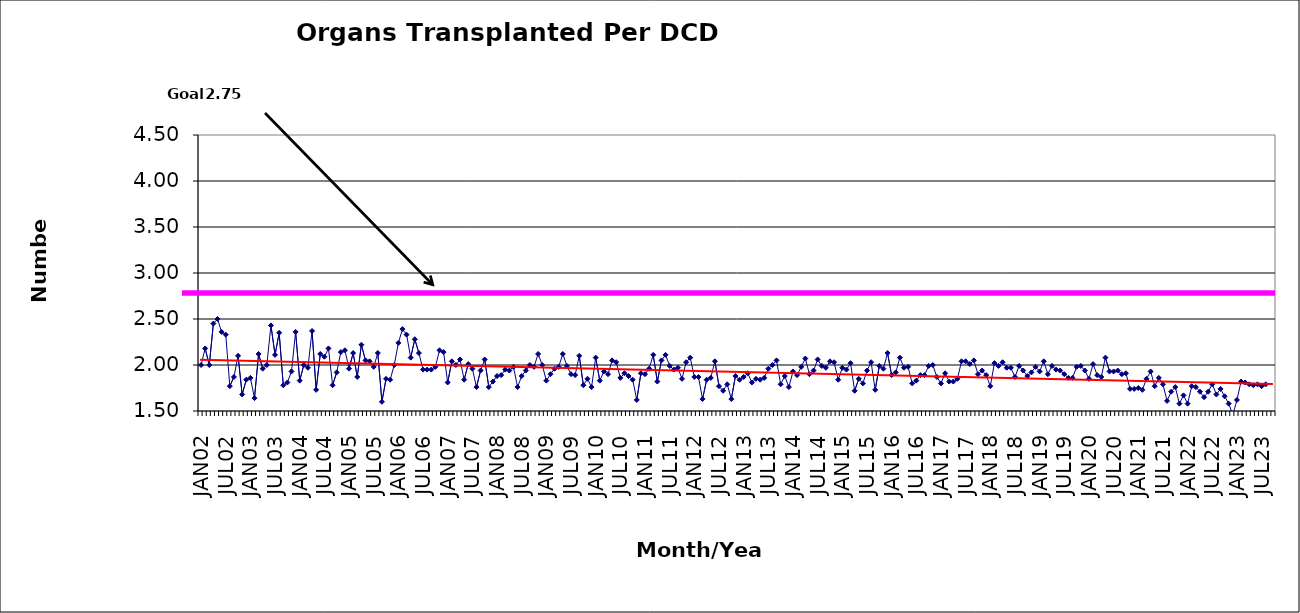
| Category | Series 0 |
|---|---|
| JAN02 | 2 |
| FEB02 | 2.18 |
| MAR02 | 2 |
| APR02 | 2.45 |
| MAY02 | 2.5 |
| JUN02 | 2.36 |
| JUL02 | 2.33 |
| AUG02 | 1.77 |
| SEP02 | 1.87 |
| OCT02 | 2.1 |
| NOV02 | 1.68 |
| DEC02 | 1.84 |
| JAN03 | 1.86 |
| FEB03 | 1.64 |
| MAR03 | 2.12 |
| APR03 | 1.96 |
| MAY03 | 2 |
| JUN03 | 2.43 |
| JUL03 | 2.11 |
| AUG03 | 2.35 |
| SEP03 | 1.78 |
| OCT03 | 1.81 |
| NOV03 | 1.93 |
| DEC03 | 2.36 |
| JAN04 | 1.83 |
| FEB04 | 2 |
| MAR04 | 1.97 |
| APR04 | 2.37 |
| MAY04 | 1.73 |
| JUN04 | 2.12 |
| JUL04 | 2.09 |
| AUG04 | 2.18 |
| SEP04 | 1.78 |
| OCT04 | 1.92 |
| NOV04 | 2.14 |
| DEC04 | 2.16 |
| JAN05 | 1.96 |
| FEB05 | 2.13 |
| MAR05 | 1.87 |
| APR05 | 2.22 |
| MAY05 | 2.05 |
| JUN05 | 2.04 |
| JUL05 | 1.98 |
| AUG05 | 2.13 |
| SEP05 | 1.6 |
| OCT05 | 1.85 |
| NOV05 | 1.84 |
| DEC05 | 2 |
| JAN06 | 2.24 |
| FEB06 | 2.39 |
| MAR06 | 2.33 |
| APR06 | 2.08 |
| MAY06 | 2.28 |
| JUN06 | 2.13 |
| JUL06 | 1.95 |
| AUG06 | 1.95 |
| SEP06 | 1.95 |
| OCT06 | 1.98 |
| NOV06 | 2.16 |
| DEC06 | 2.14 |
| JAN07 | 1.81 |
| FEB07 | 2.04 |
| MAR07 | 2 |
| APR07 | 2.06 |
| MAY07 | 1.84 |
| JUN07 | 2.01 |
| JUL07 | 1.96 |
| AUG07 | 1.76 |
| SEP07 | 1.94 |
| OCT07 | 2.06 |
| NOV07 | 1.76 |
| DEC07 | 1.82 |
| JAN08 | 1.88 |
| FEB08 | 1.89 |
| MAR08 | 1.95 |
| APR08 | 1.94 |
| MAY08 | 1.98 |
| JUN08 | 1.76 |
| JUL08 | 1.88 |
| AUG08 | 1.94 |
| SEP08 | 2 |
| OCT08 | 1.98 |
| NOV08 | 2.12 |
| DEC08 | 2 |
| JAN09 | 1.83 |
| FEB09 | 1.9 |
| MAR09 | 1.96 |
| APR09 | 1.98 |
| MAY09 | 2.12 |
| JUN09 | 1.99 |
| JUL09 | 1.9 |
| AUG09 | 1.89 |
| SEP09 | 2.1 |
| OCT09 | 1.78 |
| NOV09 | 1.85 |
| DEC09 | 1.76 |
| JAN10 | 2.08 |
| FEB10 | 1.83 |
| MAR10 | 1.93 |
| APR10 | 1.9 |
| MAY10 | 2.05 |
| JUN10 | 2.03 |
| JUL10 | 1.86 |
| AUG10 | 1.91 |
| SEP10 | 1.88 |
| OCT10 | 1.84 |
| NOV10 | 1.62 |
| DEC10 | 1.91 |
| JAN11 | 1.9 |
| FEB11 | 1.96 |
| MAR11 | 2.11 |
| APR11 | 1.82 |
| MAY11 | 2.05 |
| JUN11 | 2.11 |
| JUL11 | 1.99 |
| AUG11 | 1.95 |
| SEP11 | 1.97 |
| OCT11 | 1.85 |
| NOV11 | 2.03 |
| DEC11 | 2.08 |
| JAN12 | 1.87 |
| FEB12 | 1.87 |
| MAR12 | 1.63 |
| APR12 | 1.84 |
| MAY12 | 1.86 |
| JUN12 | 2.04 |
| JUL12 | 1.77 |
| AUG12 | 1.72 |
| SEP12 | 1.79 |
| OCT12 | 1.63 |
| NOV12 | 1.88 |
| DEC12 | 1.84 |
| JAN13 | 1.87 |
| FEB13 | 1.91 |
| MAR13 | 1.81 |
| APR13 | 1.85 |
| MAY13 | 1.84 |
| JUN13 | 1.86 |
| JUL13 | 1.96 |
| AUG13 | 2 |
| SEP13 | 2.05 |
| OCT13 | 1.79 |
| NOV13 | 1.88 |
| DEC13 | 1.76 |
| JAN14 | 1.93 |
| FEB14 | 1.89 |
| MAR14 | 1.98 |
| APR14 | 2.07 |
| MAY14 | 1.9 |
| JUN14 | 1.94 |
| JUL14 | 2.06 |
| AUG14 | 1.99 |
| SEP14 | 1.97 |
| OCT14 | 2.04 |
| NOV14 | 2.03 |
| DEC14 | 1.84 |
| JAN15 | 1.97 |
| FEB15 | 1.95 |
| MAR15 | 2.02 |
| APR15 | 1.72 |
| MAY15 | 1.85 |
| JUN15 | 1.8 |
| JUL15 | 1.94 |
| AUG15 | 2.03 |
| SEP15 | 1.73 |
| OCT15 | 1.99 |
| NOV15 | 1.96 |
| DEC15 | 2.13 |
| JAN16 | 1.89 |
| FEB16 | 1.92 |
| MAR16 | 2.08 |
| APR16 | 1.97 |
| MAY16 | 1.98 |
| JUN16 | 1.8 |
| JUL16 | 1.83 |
| AUG16 | 1.89 |
| SEP16 | 1.89 |
| OCT16 | 1.99 |
| NOV16 | 2 |
| DEC16 | 1.87 |
| JAN17 | 1.8 |
| FEB17 | 1.91 |
| MAR17 | 1.82 |
| APR17 | 1.82 |
| MAY17 | 1.85 |
| JUN17 | 2.04 |
| JUL17 | 2.04 |
| AUG17 | 2.01 |
| SEP17 | 2.05 |
| OCT17 | 1.9 |
| NOV17 | 1.94 |
| DEC17 | 1.89 |
| JAN18 | 1.77 |
| FEB18 | 2.02 |
| MAR18 | 1.99 |
| APR18 | 2.03 |
| MAY18 | 1.97 |
| JUN18 | 1.97 |
| JUL18 | 1.87 |
| AUG18 | 1.99 |
| SEP18 | 1.94 |
| OCT18 | 1.88 |
| NOV18 | 1.92 |
| DEC18 | 1.98 |
| JAN19 | 1.93 |
| FEB19 | 2.04 |
| MAR19 | 1.9 |
| APR19 | 1.99 |
| MAY19 | 1.95 |
| JUN19 | 1.94 |
| JUL19 | 1.9 |
| AUG19 | 1.86 |
| SEP19 | 1.86 |
| OCT19 | 1.98 |
| NOV19 | 1.99 |
| DEC19 | 1.94 |
| JAN20 | 1.85 |
| FEB20 | 2.01 |
| MAR20 | 1.89 |
| APR20 | 1.87 |
| MAY20 | 2.08 |
| JUN20 | 1.93 |
| JUL20 | 1.93 |
| AUG20 | 1.94 |
| SEP20 | 1.9 |
| OCT20 | 1.91 |
| NOV20 | 1.74 |
| DEC20 | 1.74 |
| JAN21 | 1.75 |
| FEB21 | 1.73 |
| MAR21 | 1.85 |
| APR21 | 1.93 |
| MAY21 | 1.77 |
| JUN21 | 1.86 |
| JUL21 | 1.79 |
| AUG21 | 1.61 |
| SEP21 | 1.71 |
| OCT21 | 1.76 |
| NOV21 | 1.58 |
| DEC21 | 1.67 |
| JAN22 | 1.58 |
| FEB22 | 1.77 |
| MAR22 | 1.76 |
| APR22 | 1.71 |
| MAY22 | 1.65 |
| JUN22 | 1.71 |
| JUL22 | 1.79 |
| AUG22 | 1.68 |
| SEP22 | 1.74 |
| OCT22 | 1.66 |
| NOV22 | 1.58 |
| DEC22 | 1.46 |
| JAN23 | 1.62 |
| FEB23 | 1.82 |
| MAR23 | 1.81 |
| APR23 | 1.79 |
| MAY23 | 1.78 |
| JUN23 | 1.79 |
| JUL23 | 1.77 |
| AUG23 | 1.79 |